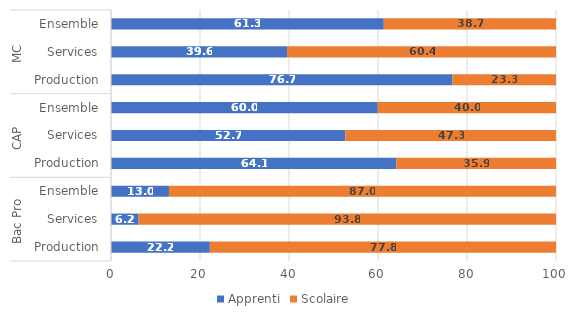
| Category | Apprenti | Scolaire |
|---|---|---|
| 0 | 22.212 | 77.788 |
| 1 | 6.211 | 93.789 |
| 2 | 13.026 | 86.974 |
| 3 | 64.099 | 35.901 |
| 4 | 52.672 | 47.328 |
| 5 | 59.952 | 40.048 |
| 6 | 76.72 | 23.28 |
| 7 | 39.552 | 60.448 |
| 8 | 61.3 | 38.7 |